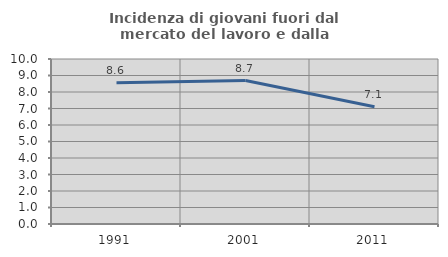
| Category | Incidenza di giovani fuori dal mercato del lavoro e dalla formazione  |
|---|---|
| 1991.0 | 8.557 |
| 2001.0 | 8.696 |
| 2011.0 | 7.107 |